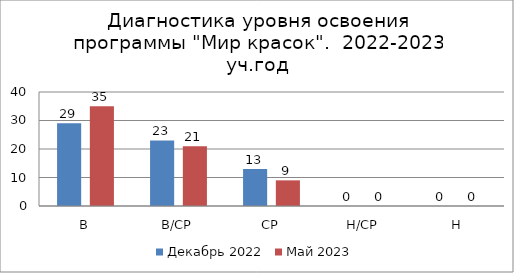
| Category | Декабрь 2022 | Май 2023 |
|---|---|---|
| В | 29 | 35 |
| В/СР | 23 | 21 |
| СР | 13 | 9 |
| Н/СР | 0 | 0 |
| Н | 0 | 0 |